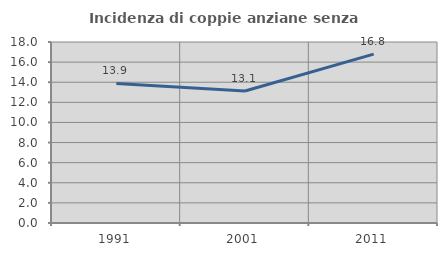
| Category | Incidenza di coppie anziane senza figli  |
|---|---|
| 1991.0 | 13.882 |
| 2001.0 | 13.121 |
| 2011.0 | 16.791 |